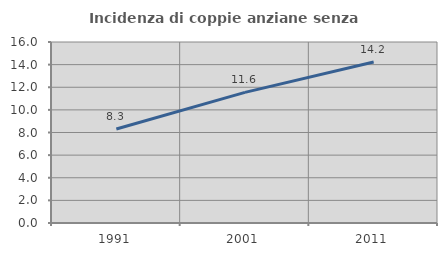
| Category | Incidenza di coppie anziane senza figli  |
|---|---|
| 1991.0 | 8.304 |
| 2001.0 | 11.55 |
| 2011.0 | 14.226 |